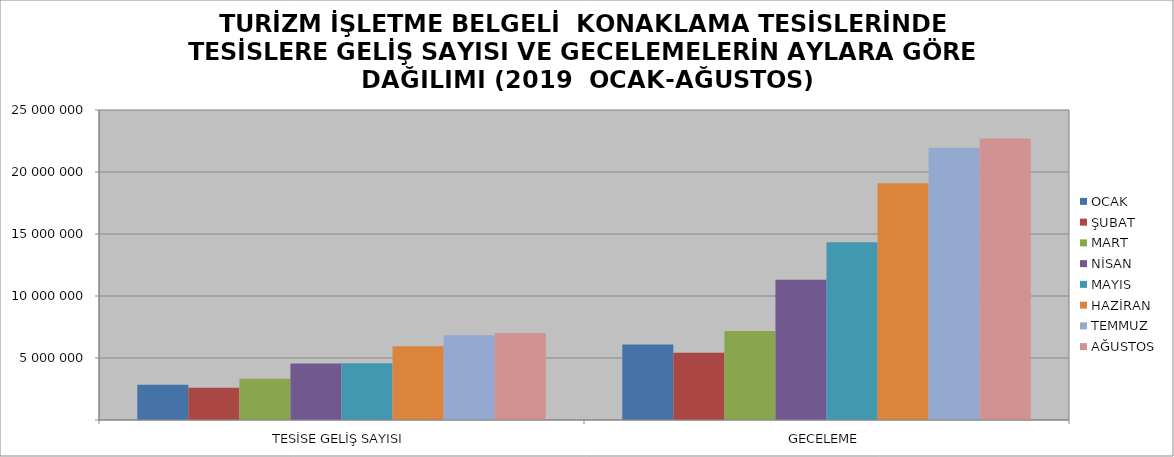
| Category | OCAK | ŞUBAT | MART | NİSAN | MAYIS | HAZİRAN | TEMMUZ | AĞUSTOS |
|---|---|---|---|---|---|---|---|---|
| TESİSE GELİŞ SAYISI | 2833509 | 2607189 | 3326719 | 4561709 | 4585981 | 5949977 | 6830740 | 7020795 |
| GECELEME | 6098050 | 5425989 | 7182593 | 11302946 | 14338328 | 19092571 | 21955256 | 22706728 |